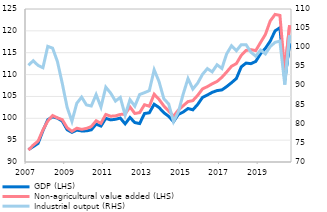
| Category | GDP (LHS) | Non-agricultural value added (LHS) |
|---|---|---|
| 2007 | 92.831 | 92.741 |
| II | 93.526 | 93.864 |
| III | 94.266 | 94.78 |
| IV | 97.145 | 97.33 |
| 2008 | 99.659 | 99.372 |
| II | 100.341 | 100.628 |
| III | 100.028 | 100.086 |
| IV | 99.356 | 99.69 |
| 2009 | 97.389 | 97.843 |
| II | 96.782 | 97.016 |
| III | 97.302 | 97.73 |
| IV | 97.105 | 97.47 |
| 2010 | 97.125 | 97.678 |
| II | 97.356 | 98.101 |
| III | 98.663 | 99.428 |
| IV | 98.219 | 98.86 |
| 2011 | 99.983 | 100.874 |
| II | 99.634 | 100.472 |
| III | 99.77 | 100.549 |
| IV | 100.042 | 100.88 |
| 2012 | 98.729 | 100.977 |
| II | 100.186 | 102.589 |
| III | 99.019 | 101.099 |
| IV | 98.792 | 101.295 |
| 2013 | 101.091 | 103.098 |
| II | 101.261 | 102.765 |
| III | 103.216 | 105.505 |
| IV | 102.464 | 104.329 |
| 2014 | 101.28 | 102.825 |
| II | 100.443 | 101.654 |
| III | 99.229 | 100.468 |
| IV | 100.88 | 101.88 |
| 2015 | 101.427 | 102.869 |
| II | 102.241 | 103.822 |
| III | 101.936 | 104.041 |
| IV | 103.173 | 105.25 |
| 2016 | 104.781 | 106.727 |
| II | 105.322 | 107.243 |
| III | 105.931 | 107.881 |
| IV | 106.337 | 108.418 |
| 2017 | 106.487 | 109.373 |
| II | 107.253 | 110.59 |
| III | 108.145 | 111.903 |
| IV | 109.098 | 112.516 |
| 2018 | 111.752 | 114.381 |
| II | 112.632 | 115.509 |
| III | 112.492 | 115.703 |
| IV | 113.002 | 115.487 |
| 2019 | 114.773 | 117.347 |
| II | 116.013 | 119.176 |
| III | 117.642 | 122.262 |
| IV | 119.996 | 123.763 |
| 2020 | 120.716 | 123.537 |
| II | 108.757 | 110.864 |
| III | 117.131 | 121.288 |